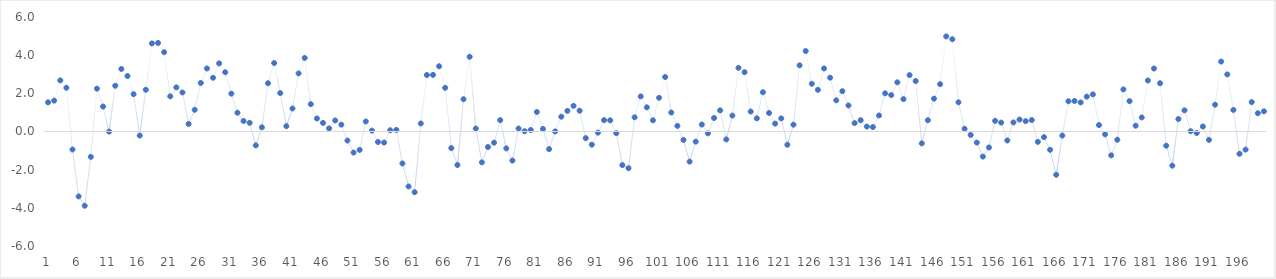
| Category | Series 0 |
|---|---|
| 0 | 1.528 |
| 1 | 1.616 |
| 2 | 2.677 |
| 3 | 2.292 |
| 4 | -0.944 |
| 5 | -3.402 |
| 6 | -3.891 |
| 7 | -1.329 |
| 8 | 2.243 |
| 9 | 1.308 |
| 10 | -0.006 |
| 11 | 2.398 |
| 12 | 3.279 |
| 13 | 2.907 |
| 14 | 1.956 |
| 15 | -0.213 |
| 16 | 2.187 |
| 17 | 4.616 |
| 18 | 4.641 |
| 19 | 4.157 |
| 20 | 1.843 |
| 21 | 2.313 |
| 22 | 2.046 |
| 23 | 0.395 |
| 24 | 1.135 |
| 25 | 2.542 |
| 26 | 3.304 |
| 27 | 2.816 |
| 28 | 3.569 |
| 29 | 3.105 |
| 30 | 1.982 |
| 31 | 0.984 |
| 32 | 0.551 |
| 33 | 0.455 |
| 34 | -0.728 |
| 35 | 0.219 |
| 36 | 2.529 |
| 37 | 3.587 |
| 38 | 2.013 |
| 39 | 0.279 |
| 40 | 1.206 |
| 41 | 3.044 |
| 42 | 3.853 |
| 43 | 1.433 |
| 44 | 0.681 |
| 45 | 0.449 |
| 46 | 0.164 |
| 47 | 0.577 |
| 48 | 0.359 |
| 49 | -0.474 |
| 50 | -1.104 |
| 51 | -0.964 |
| 52 | 0.525 |
| 53 | 0.045 |
| 54 | -0.549 |
| 55 | -0.581 |
| 56 | 0.066 |
| 57 | 0.082 |
| 58 | -1.674 |
| 59 | -2.88 |
| 60 | -3.181 |
| 61 | 0.42 |
| 62 | 2.96 |
| 63 | 2.968 |
| 64 | 3.419 |
| 65 | 2.29 |
| 66 | -0.871 |
| 67 | -1.755 |
| 68 | 1.691 |
| 69 | 3.914 |
| 70 | 0.157 |
| 71 | -1.616 |
| 72 | -0.813 |
| 73 | -0.586 |
| 74 | 0.597 |
| 75 | -0.885 |
| 76 | -1.524 |
| 77 | 0.155 |
| 78 | 0.016 |
| 79 | 0.079 |
| 80 | 1.024 |
| 81 | 0.135 |
| 82 | -0.922 |
| 83 | 0.004 |
| 84 | 0.776 |
| 85 | 1.082 |
| 86 | 1.345 |
| 87 | 1.089 |
| 88 | -0.348 |
| 89 | -0.692 |
| 90 | -0.061 |
| 91 | 0.596 |
| 92 | 0.584 |
| 93 | -0.088 |
| 94 | -1.762 |
| 95 | -1.923 |
| 96 | 0.745 |
| 97 | 1.839 |
| 98 | 1.267 |
| 99 | 0.587 |
| 100 | 1.766 |
| 101 | 2.855 |
| 102 | 0.995 |
| 103 | 0.293 |
| 104 | -0.439 |
| 105 | -1.578 |
| 106 | -0.531 |
| 107 | 0.366 |
| 108 | -0.099 |
| 109 | 0.707 |
| 110 | 1.107 |
| 111 | -0.415 |
| 112 | 0.834 |
| 113 | 3.335 |
| 114 | 3.109 |
| 115 | 1.046 |
| 116 | 0.691 |
| 117 | 2.058 |
| 118 | 0.97 |
| 119 | 0.414 |
| 120 | 0.687 |
| 121 | -0.694 |
| 122 | 0.359 |
| 123 | 3.466 |
| 124 | 4.217 |
| 125 | 2.499 |
| 126 | 2.183 |
| 127 | 3.304 |
| 128 | 2.821 |
| 129 | 1.634 |
| 130 | 2.112 |
| 131 | 1.364 |
| 132 | 0.439 |
| 133 | 0.592 |
| 134 | 0.258 |
| 135 | 0.234 |
| 136 | 0.84 |
| 137 | 2.002 |
| 138 | 1.909 |
| 139 | 2.577 |
| 140 | 1.697 |
| 141 | 2.956 |
| 142 | 2.646 |
| 143 | -0.622 |
| 144 | 0.591 |
| 145 | 1.722 |
| 146 | 2.482 |
| 147 | 4.981 |
| 148 | 4.835 |
| 149 | 1.53 |
| 150 | 0.143 |
| 151 | -0.179 |
| 152 | -0.58 |
| 153 | -1.315 |
| 154 | -0.838 |
| 155 | 0.558 |
| 156 | 0.468 |
| 157 | -0.47 |
| 158 | 0.475 |
| 159 | 0.627 |
| 160 | 0.542 |
| 161 | 0.6 |
| 162 | -0.542 |
| 163 | -0.295 |
| 164 | -0.959 |
| 165 | -2.268 |
| 166 | -0.211 |
| 167 | 1.585 |
| 168 | 1.599 |
| 169 | 1.523 |
| 170 | 1.828 |
| 171 | 1.943 |
| 172 | 0.338 |
| 173 | -0.149 |
| 174 | -1.252 |
| 175 | -0.433 |
| 176 | 2.205 |
| 177 | 1.59 |
| 178 | 0.303 |
| 179 | 0.735 |
| 180 | 2.672 |
| 181 | 3.302 |
| 182 | 2.529 |
| 183 | -0.745 |
| 184 | -1.79 |
| 185 | 0.654 |
| 186 | 1.108 |
| 187 | 0.014 |
| 188 | -0.078 |
| 189 | 0.262 |
| 190 | -0.439 |
| 191 | 1.404 |
| 192 | 3.666 |
| 193 | 2.991 |
| 194 | 1.129 |
| 195 | -1.167 |
| 196 | -0.948 |
| 197 | 1.541 |
| 198 | 0.956 |
| 199 | 1.058 |